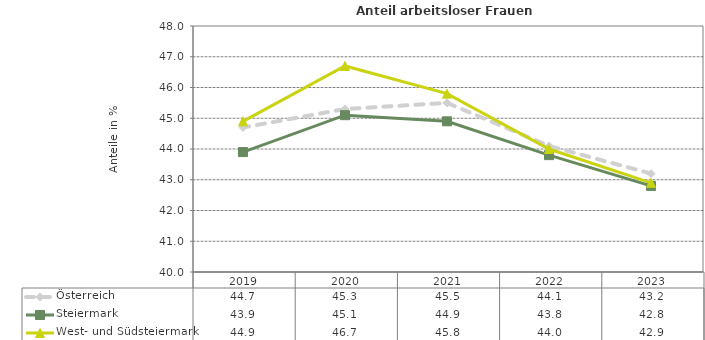
| Category | Österreich | Steiermark | West- und Südsteiermark |
|---|---|---|---|
| 2023.0 | 43.2 | 42.8 | 42.9 |
| 2022.0 | 44.1 | 43.8 | 44 |
| 2021.0 | 45.5 | 44.9 | 45.8 |
| 2020.0 | 45.3 | 45.1 | 46.7 |
| 2019.0 | 44.7 | 43.9 | 44.9 |